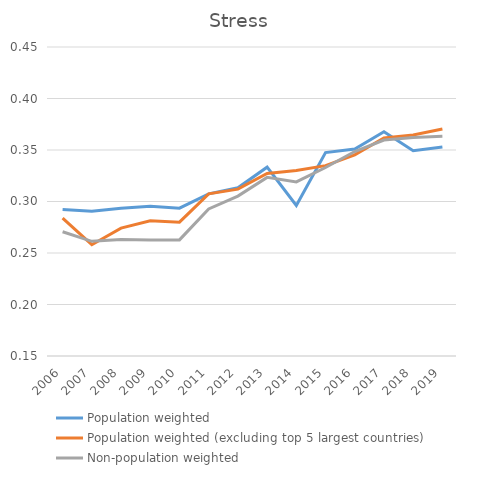
| Category | Population weighted | Population weighted (excluding top 5 largest countries) | Non-population weighted |
|---|---|---|---|
| 2006.0 | 0.292 | 0.284 | 0.271 |
| 2007.0 | 0.291 | 0.258 | 0.261 |
| 2008.0 | 0.293 | 0.274 | 0.263 |
| 2009.0 | 0.296 | 0.281 | 0.263 |
| 2010.0 | 0.294 | 0.28 | 0.263 |
| 2011.0 | 0.307 | 0.307 | 0.293 |
| 2012.0 | 0.313 | 0.312 | 0.305 |
| 2013.0 | 0.333 | 0.327 | 0.323 |
| 2014.0 | 0.296 | 0.33 | 0.319 |
| 2015.0 | 0.348 | 0.335 | 0.333 |
| 2016.0 | 0.351 | 0.345 | 0.349 |
| 2017.0 | 0.368 | 0.362 | 0.36 |
| 2018.0 | 0.349 | 0.365 | 0.362 |
| 2019.0 | 0.353 | 0.37 | 0.363 |